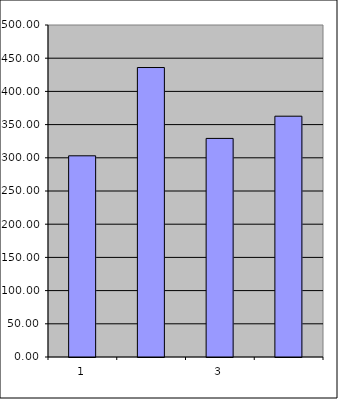
| Category | Series 0 |
|---|---|
| 0 | 303 |
| 1 | 435.957 |
| 2 | 329.191 |
| 3 | 362.653 |